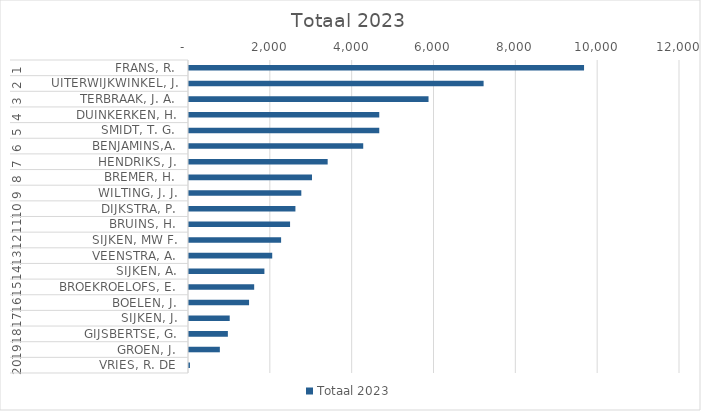
| Category | Totaal 2023 |
|---|---|
| 0 | 9655 |
| 1 | 7200 |
| 2 | 5854 |
| 3 | 4650 |
| 4 | 4650 |
| 5 | 4258 |
| 6 | 3389 |
| 7 | 3006 |
| 8 | 2745 |
| 9 | 2601 |
| 10 | 2470 |
| 11 | 2251 |
| 12 | 2034 |
| 13 | 1843 |
| 14 | 1593 |
| 15 | 1468 |
| 16 | 995 |
| 17 | 950 |
| 18 | 754 |
| 19 | 23 |